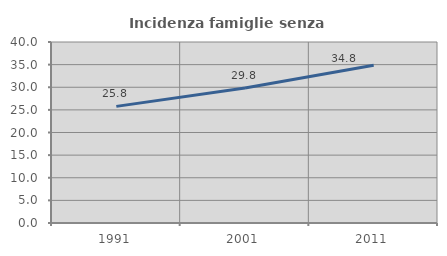
| Category | Incidenza famiglie senza nuclei |
|---|---|
| 1991.0 | 25.771 |
| 2001.0 | 29.829 |
| 2011.0 | 34.85 |